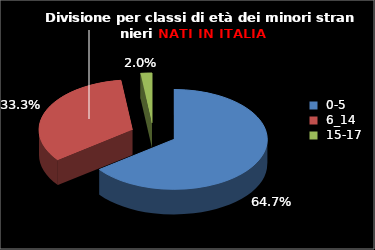
| Category | Series 0 |
|---|---|
| 0-5 | 33 |
| 6_14 | 17 |
| 15-17 | 1 |